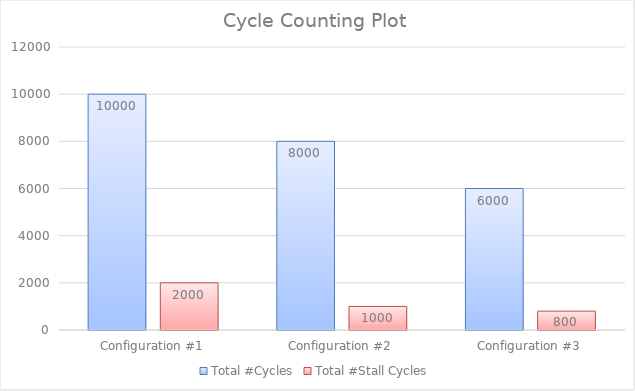
| Category | Total #Cycles | Total #Stall Cycles |
|---|---|---|
| Configuration #1 | 10000 | 2000 |
| Configuration #2 | 8000 | 1000 |
| Configuration #3 | 6000 | 800 |